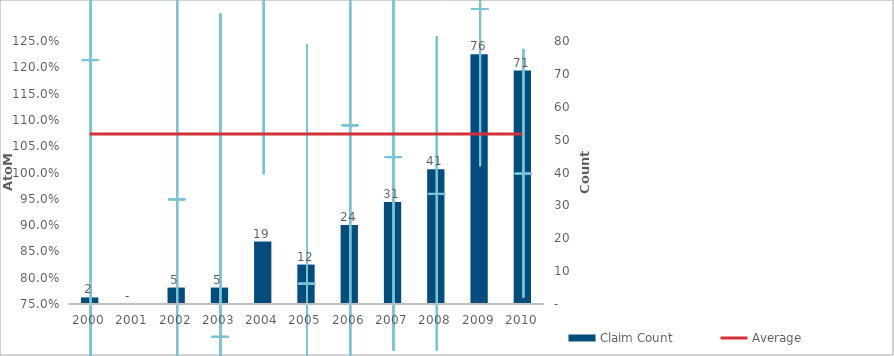
| Category | Claim Count |
|---|---|
| 0 | 2 |
| 1 | 0 |
| 2 | 5 |
| 3 | 5 |
| 4 | 19 |
| 5 | 12 |
| 6 | 24 |
| 7 | 31 |
| 8 | 41 |
| 9 | 76 |
| 10 | 71 |